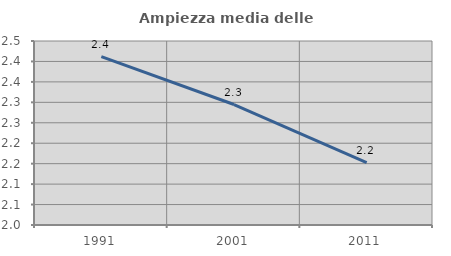
| Category | Ampiezza media delle famiglie |
|---|---|
| 1991.0 | 2.412 |
| 2001.0 | 2.295 |
| 2011.0 | 2.153 |